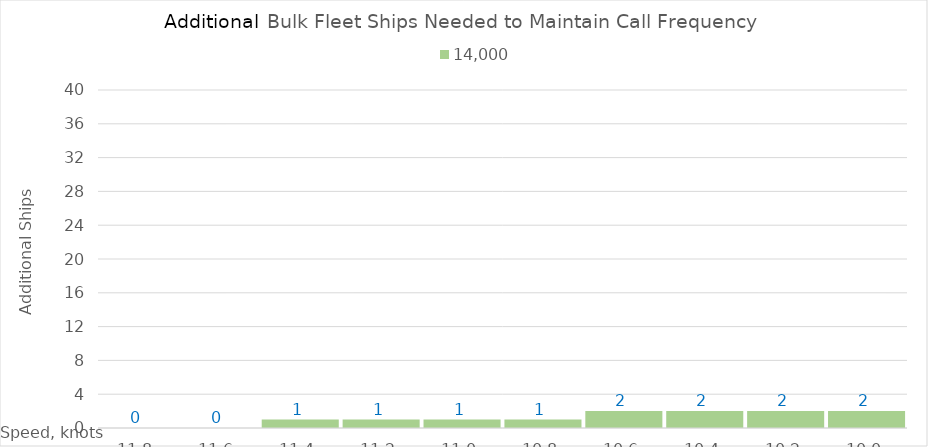
| Category | 14,000 |
|---|---|
| 11.8 | 0 |
| 11.600000000000001 | 0 |
| 11.400000000000002 | 1 |
| 11.200000000000003 | 1 |
| 11.000000000000004 | 1 |
| 10.800000000000004 | 1 |
| 10.600000000000005 | 2 |
| 10.400000000000006 | 2 |
| 10.200000000000006 | 2 |
| 10.000000000000007 | 2 |